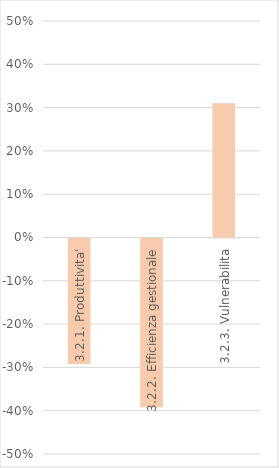
| Category | Series 0 |
|---|---|
| 3.2.1. Produttivita' | -0.29 |
| 3.2.2. Efficienza gestionale | -0.39 |
| 3.2.3. Vulnerabilita | 0.31 |